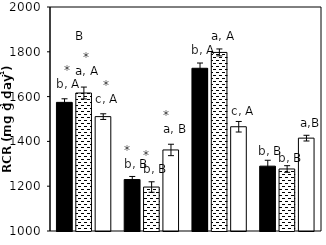
| Category |    A. brasilense |    A. chroococcum |    CK |
|---|---|---|---|
| aCO2-Bt | 1574.235 | 1616.02 | 1510.638 |
| aCO2-XIANYU | 1229.716 | 1196.258 | 1361.869 |
| eCO2-Bt | 1726.467 | 1797.172 | 1465.439 |
| eCO2-XIANYU | 1289.486 | 1276.881 | 1414.552 |